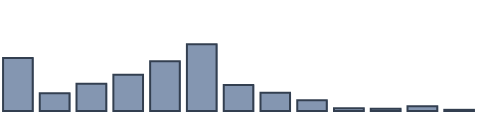
| Category | Series 0 |
|---|---|
| 0 | 16.731 |
| 1 | 5.631 |
| 2 | 8.624 |
| 3 | 11.423 |
| 4 | 15.718 |
| 5 | 21.039 |
| 6 | 8.225 |
| 7 | 5.774 |
| 8 | 3.356 |
| 9 | 0.9 |
| 10 | 0.726 |
| 11 | 1.482 |
| 12 | 0.37 |